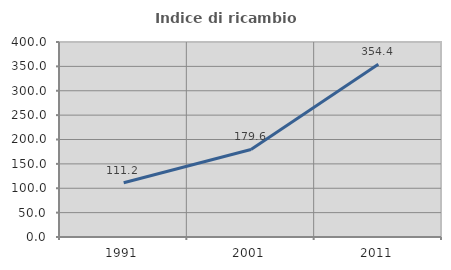
| Category | Indice di ricambio occupazionale  |
|---|---|
| 1991.0 | 111.188 |
| 2001.0 | 179.576 |
| 2011.0 | 354.388 |